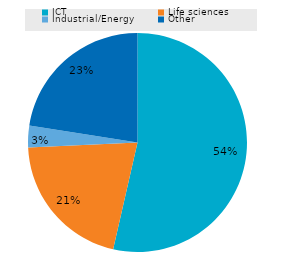
| Category | Series 0 |
|---|---|
| ICT | 35694.559 |
| Life sciences | 13790.94 |
| Industrial/Energy | 2132.668 |
| Other | 15008.397 |